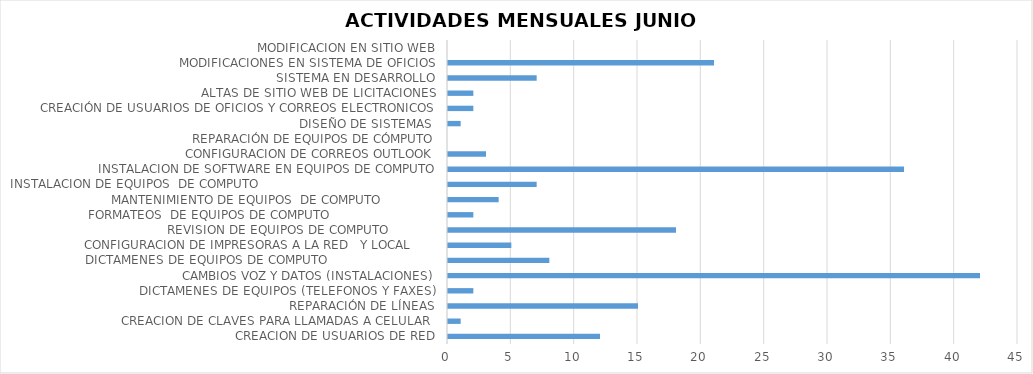
| Category | Series 0 |
|---|---|
| CREACION DE USUARIOS DE RED | 12 |
| CREACION DE CLAVES PARA LLAMADAS A CELULAR  | 1 |
| REPARACIÓN DE LÍNEAS | 15 |
| DICTAMENES DE EQUIPOS (TELEFONOS Y FAXES) | 2 |
| CAMBIOS VOZ Y DATOS (INSTALACIONES) | 42 |
| DICTAMENES DE EQUIPOS DE COMPUTO                             | 8 |
| CONFIGURACION DE IMPRESORAS A LA RED   Y LOCAL       | 5 |
| REVISION DE EQUIPOS DE COMPUTO             | 18 |
| FORMATEOS  DE EQUIPOS DE COMPUTO                            | 2 |
| MANTENIMIENTO DE EQUIPOS  DE COMPUTO               | 4 |
| INSTALACION DE EQUIPOS  DE COMPUTO                                               | 7 |
| INSTALACION DE SOFTWARE EN EQUIPOS DE COMPUTO | 36 |
| CONFIGURACION DE CORREOS OUTLOOK | 3 |
| REPARACIÓN DE EQUIPOS DE CÓMPUTO | 0 |
| DISEÑO DE SISTEMAS  | 1 |
| CREACIÓN DE USUARIOS DE OFICIOS Y CORREOS ELECTRONICOS | 2 |
| ALTAS DE SITIO WEB DE LICITACIONES | 2 |
| SISTEMA EN DESARROLLO | 7 |
| MODIFICACIONES EN SISTEMA DE OFICIOS | 21 |
| MODIFICACION EN SITIO WEB | 0 |